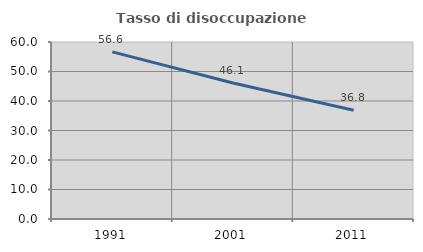
| Category | Tasso di disoccupazione giovanile  |
|---|---|
| 1991.0 | 56.647 |
| 2001.0 | 46.117 |
| 2011.0 | 36.842 |